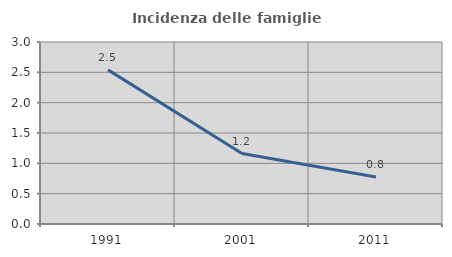
| Category | Incidenza delle famiglie numerose |
|---|---|
| 1991.0 | 2.54 |
| 2001.0 | 1.161 |
| 2011.0 | 0.774 |